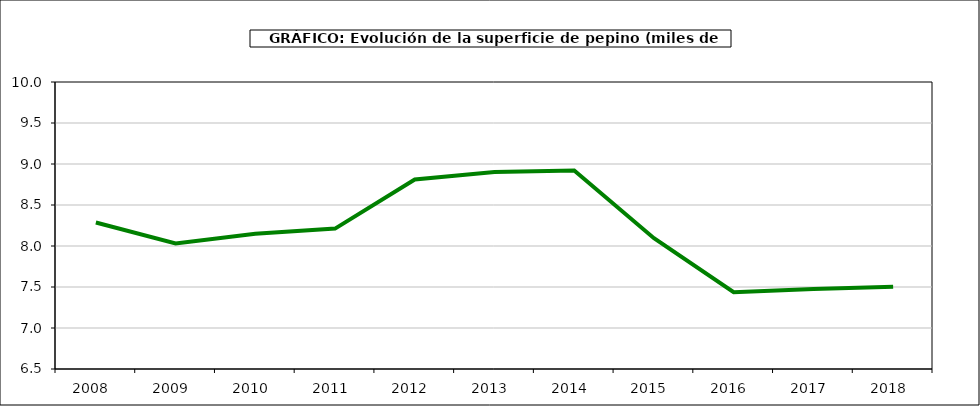
| Category | superficie |
|---|---|
| 2008.0 | 8.286 |
| 2009.0 | 8.031 |
| 2010.0 | 8.148 |
| 2011.0 | 8.212 |
| 2012.0 | 8.811 |
| 2013.0 | 8.902 |
| 2014.0 | 8.921 |
| 2015.0 | 8.095 |
| 2016.0 | 7.437 |
| 2017.0 | 7.475 |
| 2018.0 | 7.503 |